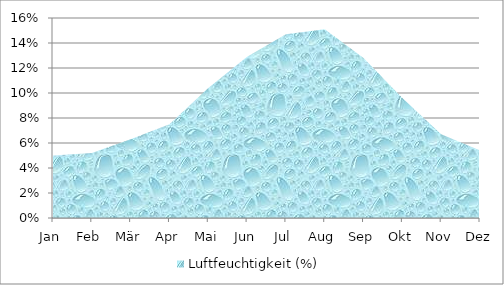
| Category | Luftfeuchtigkeit (%) |
|---|---|
| Jan | 0.05 |
| Feb | 0.052 |
| Mär | 0.063 |
| Apr | 0.075 |
| Mai | 0.104 |
| Jun | 0.129 |
| Jul | 0.147 |
| Aug | 0.151 |
| Sep | 0.128 |
| Okt | 0.096 |
| Nov | 0.067 |
| Dez | 0.054 |